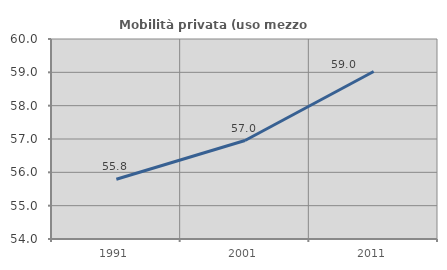
| Category | Mobilità privata (uso mezzo privato) |
|---|---|
| 1991.0 | 55.794 |
| 2001.0 | 56.954 |
| 2011.0 | 59.026 |